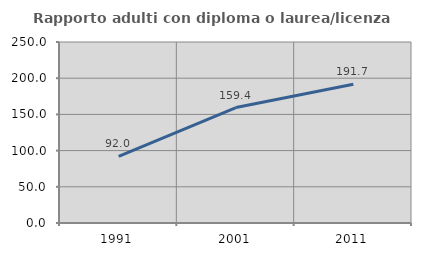
| Category | Rapporto adulti con diploma o laurea/licenza media  |
|---|---|
| 1991.0 | 92.013 |
| 2001.0 | 159.437 |
| 2011.0 | 191.667 |